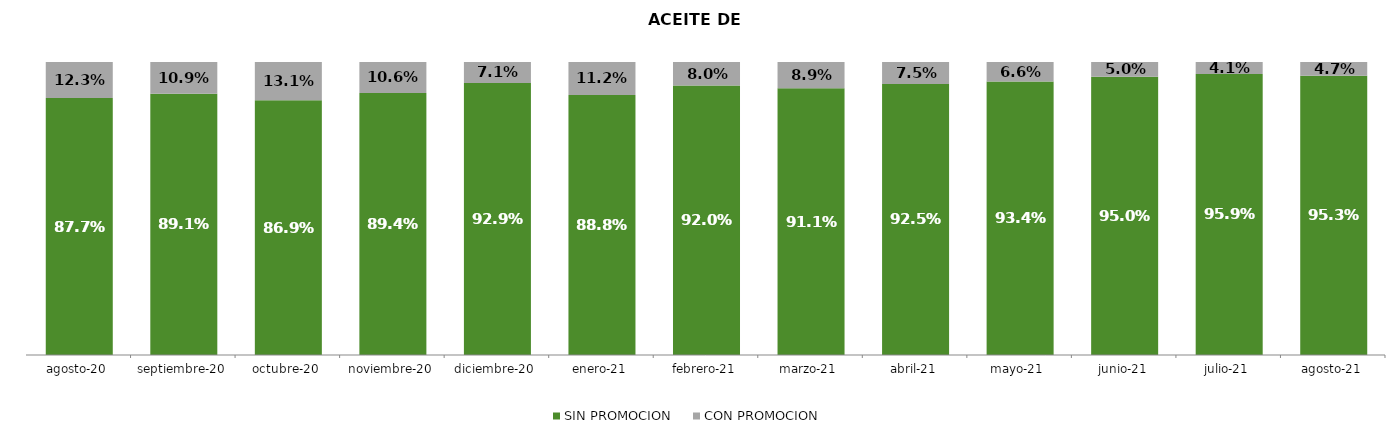
| Category | SIN PROMOCION   | CON PROMOCION   |
|---|---|---|
| 2020-08-01 | 0.877 | 0.123 |
| 2020-09-01 | 0.891 | 0.109 |
| 2020-10-01 | 0.869 | 0.131 |
| 2020-11-01 | 0.894 | 0.106 |
| 2020-12-01 | 0.929 | 0.071 |
| 2021-01-01 | 0.888 | 0.112 |
| 2021-02-01 | 0.92 | 0.08 |
| 2021-03-01 | 0.911 | 0.089 |
| 2021-04-01 | 0.925 | 0.075 |
| 2021-05-01 | 0.934 | 0.066 |
| 2021-06-01 | 0.95 | 0.05 |
| 2021-07-01 | 0.959 | 0.041 |
| 2021-08-01 | 0.953 | 0.047 |